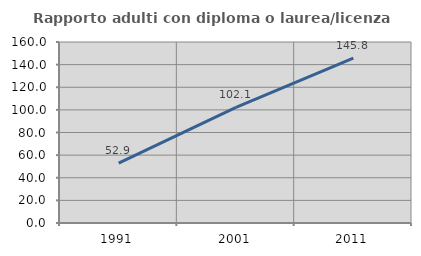
| Category | Rapporto adulti con diploma o laurea/licenza media  |
|---|---|
| 1991.0 | 52.941 |
| 2001.0 | 102.143 |
| 2011.0 | 145.806 |